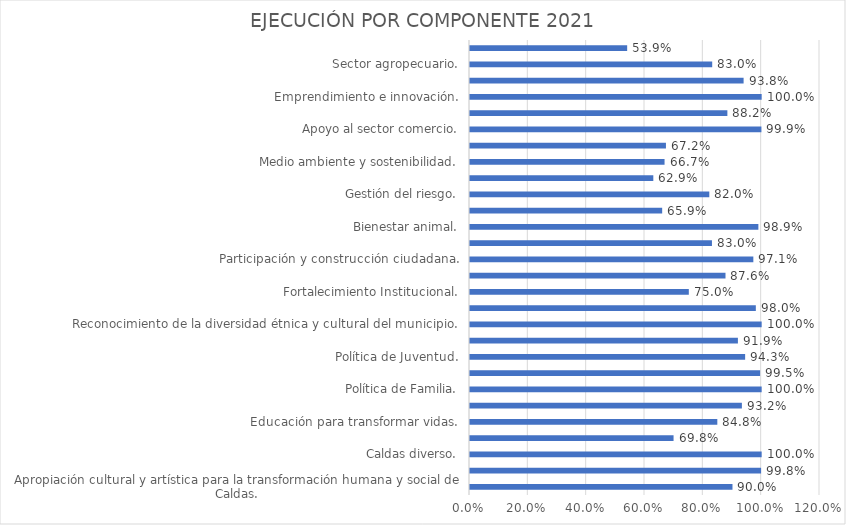
| Category | EJECUCIÓN POR COMPONENTE 2021 |
|---|---|
| Apropiación cultural y artística para la transformación humana y social de Caldas. | 0.9 |
| Atención a víctimas del conflicto. | 0.998 |
| Caldas diverso. | 1 |
| Caldas se mueve a través del deporte y la actividad física. | 0.698 |
| Educación para transformar vidas. | 0.848 |
| Población con discapacidad y adulto mayor. | 0.932 |
| Política de Familia. | 1 |
| Política de Infancia | 0.995 |
| Política de Juventud. | 0.943 |
| Política orientada a las mujeres y las niñas. | 0.919 |
| Reconocimiento de la diversidad étnica y cultural del municipio. | 1 |
| Salud y bienestar. | 0.98 |
| Fortalecimiento Institucional. | 0.75 |
| Justicia y seguridad. | 0.876 |
| Participación y construcción ciudadana. | 0.971 |
| Transparencia, rendición de cuentas y legalidad. | 0.83 |
| Bienestar animal. | 0.989 |
| El espacio público en el municipio. | 0.659 |
| Gestión del riesgo. | 0.82 |
| Hábitat y desarrollo sostenible. | 0.629 |
| Medio ambiente y sostenibilidad. | 0.667 |
| Servicios públicos. | 0.672 |
| Apoyo al sector comercio. | 0.999 |
| Apoyo y promoción al turismo. | 0.882 |
| Emprendimiento e innovación. | 1 |
| Movilidad Sostenible y con Bienestar. | 0.938 |
| Sector agropecuario. | 0.83 |
| Seguridad alimentaria. | 0.539 |